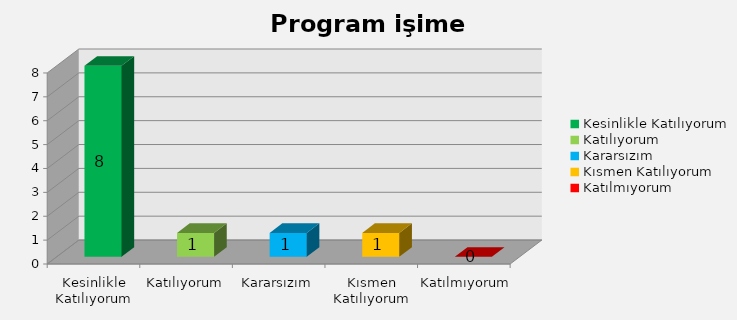
| Category | Program işime yarayabilir ;) |
|---|---|
| Kesinlikle Katılıyorum | 8 |
| Katılıyorum | 1 |
| Kararsızım | 1 |
| Kısmen Katılıyorum | 1 |
| Katılmıyorum | 0 |